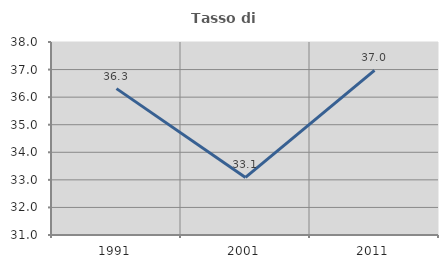
| Category | Tasso di occupazione   |
|---|---|
| 1991.0 | 36.309 |
| 2001.0 | 33.087 |
| 2011.0 | 36.971 |